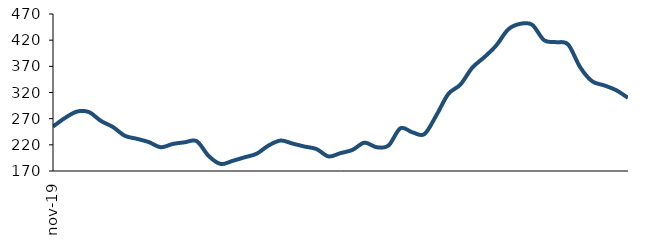
| Category | Series 0 |
|---|---|
| 2019-11-01 | 254.863 |
| 2019-12-01 | 271.361 |
| 2020-01-01 | 283.496 |
| 2020-02-01 | 282.571 |
| 2020-03-01 | 265.686 |
| 2020-04-01 | 254.092 |
| 2020-05-01 | 237.244 |
| 2020-06-01 | 231.555 |
| 2020-07-01 | 225.236 |
| 2020-08-01 | 215.435 |
| 2020-09-01 | 221.664 |
| 2020-10-01 | 224.87 |
| 2020-11-01 | 226.946 |
| 2020-12-01 | 198.561 |
| 2021-01-01 | 183.435 |
| 2021-02-01 | 189.419 |
| 2021-03-01 | 196.21 |
| 2021-04-01 | 203.011 |
| 2021-05-01 | 218.776 |
| 2021-06-01 | 228.209 |
| 2021-07-01 | 222.41 |
| 2021-08-01 | 216.706 |
| 2021-09-01 | 211.912 |
| 2021-10-01 | 197.858 |
| 2021-11-01 | 204.149 |
| 2021-12-01 | 210.311 |
| 2022-01-01 | 224.106 |
| 2022-02-01 | 215.528 |
| 2022-03-01 | 218.49 |
| 2022-04-01 | 251.637 |
| 2022-05-01 | 243.929 |
| 2022-06-01 | 240.483 |
| 2022-07-01 | 276.323 |
| 2022-08-01 | 317.225 |
| 2022-09-01 | 334.931 |
| 2022-10-01 | 367.369 |
| 2022-11-01 | 387.357 |
| 2022-12-01 | 409.854 |
| 2023-01-01 | 440.564 |
| 2023-02-01 | 451.235 |
| 2023-03-01 | 449.409 |
| 2023-04-01 | 419.821 |
| 2023-05-01 | 416.162 |
| 2023-06-01 | 411.743 |
| 2023-07-01 | 368.527 |
| 2023-08-01 | 341.6 |
| 2023-09-01 | 333.649 |
| 2023-10-01 | 324.552 |
| 2023-11-01 | 309.764 |